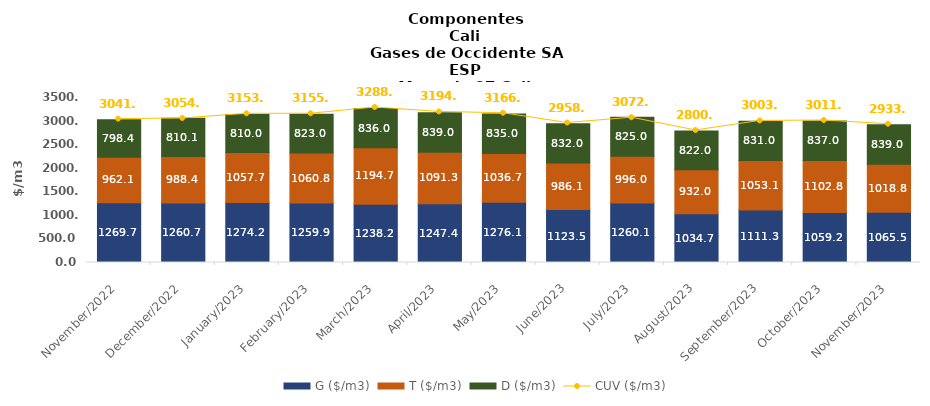
| Category | G ($/m3) | T ($/m3) | D ($/m3) |
|---|---|---|---|
| 2022-11-01 | 1269.65 | 962.1 | 798.39 |
| 2022-12-01 | 1260.7 | 988.43 | 810.07 |
| 2023-01-01 | 1274.19 | 1057.73 | 810 |
| 2023-02-01 | 1259.91 | 1060.8 | 823 |
| 2023-03-01 | 1238.18 | 1194.68 | 836 |
| 2023-04-01 | 1247.38 | 1091.29 | 839 |
| 2023-05-01 | 1276.06 | 1036.67 | 835 |
| 2023-06-01 | 1123.54 | 986.08 | 832 |
| 2023-07-01 | 1260.12 | 995.95 | 825 |
| 2023-08-01 | 1034.65 | 931.99 | 822 |
| 2023-09-01 | 1111.32 | 1053.08 | 831 |
| 2023-10-01 | 1059.24 | 1102.78 | 837 |
| 2023-11-01 | 1065.48 | 1018.81 | 839 |